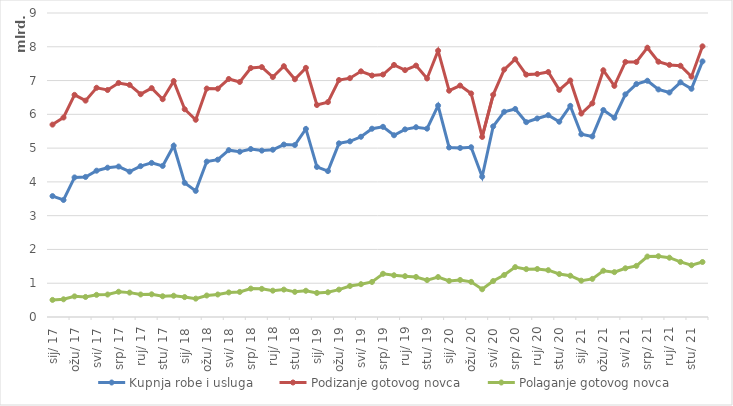
| Category | Kupnja robe i usluga | Podizanje gotovog novca | Polaganje gotovog novca |
|---|---|---|---|
| 2017-01-01 | 3579431859 | 5695813057 | 505971477 |
| 2017-02-01 | 3465062471 | 5905650526 | 524298023 |
| 2017-03-01 | 4132110078 | 6576518594 | 610672899 |
| 2017-04-01 | 4146194627 | 6405698115 | 593283764 |
| 2017-05-01 | 4331545466 | 6786132607 | 656245703 |
| 2017-06-01 | 4420401084 | 6720272792 | 665286210 |
| 2017-07-01 | 4454191914 | 6928847609 | 747986708 |
| 2017-08-01 | 4303812338 | 6870895799 | 721612254 |
| 2017-09-01 | 4466017428 | 6596491946 | 666343648 |
| 2017-10-01 | 4562095306 | 6775597691 | 671478223 |
| 2017-11-01 | 4472506453 | 6447912948 | 614247461 |
| 2017-12-01 | 5070421627 | 6983850032 | 629795691 |
| 2018-01-01 | 3970761857 | 6150362166 | 589626186 |
| 2018-02-01 | 3733864233 | 5839573308 | 543621541 |
| 2018-03-01 | 4601099257 | 6763550284 | 636323928 |
| 2018-04-01 | 4656855796 | 6758416318 | 666318190 |
| 2018-05-01 | 4939643042 | 7046946339 | 727001511 |
| 2018-06-01 | 4893590961 | 6958546377 | 742529375 |
| 2018-07-01 | 4972659540 | 7371645378 | 840639109 |
| 2018-08-01 | 4926174170 | 7398539225 | 833062337 |
| 2018-09-01 | 4951898400 | 7103767194 | 779834670 |
| 2018-10-01 | 5105376765 | 7425052401 | 811243501 |
| 2018-11-01 | 5091284082 | 7038340122 | 744465124 |
| 2018-12-01 | 5567481107 | 7376065076 | 776815255 |
| 2019-01-01 | 4442907364 | 6275899917 | 711926385 |
| 2019-02-01 | 4320140350 | 6362058436 | 732202511 |
| 2019-03-01 | 5140700342 | 7015376109 | 810345480 |
| 2019-04-01 | 5200880169 | 7071002942 | 918546770 |
| 2019-05-01 | 5335825539 | 7273046006 | 971493355 |
| 2019-06-01 | 5574421491 | 7149231768 | 1037709822 |
| 2019-07-01 | 5630367051 | 7178062210 | 1279840153 |
| 2019-08-01 | 5380446332 | 7462486991 | 1235675585 |
| 2019-09-01 | 5554968525 | 7308487837 | 1208971161 |
| 2019-10-01 | 5618367099 | 7443204522 | 1185647618 |
| 2019-11-01 | 5576230333 | 7062691220 | 1093097042 |
| 2019-12-01 | 6259150208 | 7883134692 | 1183230457 |
| 2020-01-01 | 5018727938 | 6699897228 | 1069343650 |
| 2020-02-01 | 5004372294 | 6851937184 | 1096436396 |
| 2020-03-01 | 5025958668 | 6617821862 | 1040121794 |
| 2020-04-01 | 4153664385 | 5330943234 | 820799905 |
| 2020-05-01 | 5643947112 | 6578274915 | 1065001388 |
| 2020-06-01 | 6075241804 | 7326012542 | 1243910150 |
| 2020-07-01 | 6159193196 | 7631600828 | 1477183426 |
| 2020-08-01 | 5768657876 | 7176491381 | 1417248104 |
| 2020-09-01 | 5876724832 | 7195986179 | 1421948483 |
| 2020-10-01 | 5974550525 | 7253249955 | 1386259219 |
| 2020-11-01 | 5781314069 | 6723548470 | 1272147177 |
| 2020-12-01 | 6250512362 | 7003078018 | 1221823167 |
| 2021-01-01 | 5410519053 | 6023599673 | 1074918238 |
| 2021-02-01 | 5345877666 | 6324507274 | 1128186849 |
| 2021-03-01 | 6127361404 | 7303648583 | 1370330228 |
| 2021-04-01 | 5898688311 | 6842989019 | 1328629929 |
| 2021-05-01 | 6590727130 | 7551912483 | 1442437070 |
| 2021-06-01 | 6897085395 | 7548750032 | 1514090628 |
| 2021-07-01 | 6994050641 | 7972693318 | 1789638407 |
| 2021-08-01 | 6736761317 | 7558196003 | 1799154598 |
| 2021-09-01 | 6646259816 | 7463560938 | 1755023778 |
| 2021-10-01 | 6948346608 | 7438604068 | 1630292011 |
| 2021-11-01 | 6756908190 | 7115619573 | 1532189594 |
| 2021-12-01 | 7566925545 | 8012797510 | 1628160116 |